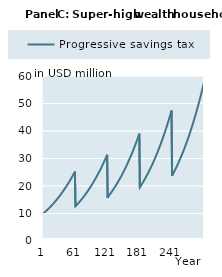
| Category | Progressive savings tax |
|---|---|
| 1 | 10000000 |
| 2 | 10167750 |
| 3 | 10337932.375 |
| 4 | 10510582.394 |
| 5 | 10685735.839 |
| 6 | 10863429.009 |
| 7 | 11043698.729 |
| 8 | 11226582.361 |
| 9 | 11412117.805 |
| 10 | 11600343.513 |
| 11 | 11791298.494 |
| 12 | 11985022.323 |
| 13 | 12181555.146 |
| 14 | 12380937.696 |
| 15 | 12583211.292 |
| 16 | 12788417.856 |
| 17 | 12996599.915 |
| 18 | 13207800.614 |
| 19 | 13422063.723 |
| 20 | 13639433.647 |
| 21 | 13859955.435 |
| 22 | 14083674.788 |
| 23 | 14310638.073 |
| 24 | 14540892.325 |
| 25 | 14774485.264 |
| 26 | 15011465.3 |
| 27 | 15251881.547 |
| 28 | 15495783.829 |
| 29 | 15743222.695 |
| 30 | 15994249.424 |
| 31 | 16248916.04 |
| 32 | 16507275.323 |
| 33 | 16769380.815 |
| 34 | 17035286.837 |
| 35 | 17305048.496 |
| 36 | 17578721.699 |
| 37 | 17856363.164 |
| 38 | 18138030.43 |
| 39 | 18423781.871 |
| 40 | 18713676.708 |
| 41 | 19007775.021 |
| 42 | 19294587.758 |
| 43 | 19585559.281 |
| 44 | 19880749.89 |
| 45 | 20180220.764 |
| 46 | 20484033.965 |
| 47 | 20792252.457 |
| 48 | 21104940.118 |
| 49 | 21422161.75 |
| 50 | 21743983.095 |
| 51 | 22070470.85 |
| 52 | 22401692.677 |
| 53 | 22737717.221 |
| 54 | 23078614.121 |
| 55 | 23424454.026 |
| 56 | 23775308.609 |
| 57 | 24131250.584 |
| 58 | 24492353.717 |
| 59 | 24858692.846 |
| 60 | 25230343.892 |
| 61 | 12615171.946 |
| 62 | 12820841.939 |
| 63 | 13029494.148 |
| 64 | 13241171.813 |
| 65 | 13455918.804 |
| 66 | 13673779.627 |
| 67 | 13894799.431 |
| 68 | 14119024.023 |
| 69 | 14346499.871 |
| 70 | 14577274.119 |
| 71 | 14811394.594 |
| 72 | 15048909.816 |
| 73 | 15289869.008 |
| 74 | 15534322.109 |
| 75 | 15782319.779 |
| 76 | 16033913.416 |
| 77 | 16289155.161 |
| 78 | 16548097.91 |
| 79 | 16810795.33 |
| 80 | 17077301.862 |
| 81 | 17347672.739 |
| 82 | 17621963.994 |
| 83 | 17900232.472 |
| 84 | 18182535.843 |
| 85 | 18468932.613 |
| 86 | 18759482.136 |
| 87 | 19054244.627 |
| 88 | 19353281.174 |
| 89 | 19656653.751 |
| 90 | 19964425.23 |
| 91 | 20276659.396 |
| 92 | 20593420.957 |
| 93 | 20914775.561 |
| 94 | 21240789.807 |
| 95 | 21571531.259 |
| 96 | 21907068.462 |
| 97 | 22247470.955 |
| 98 | 22592809.284 |
| 99 | 22943155.018 |
| 100 | 23298580.766 |
| 101 | 23659160.187 |
| 102 | 24013418.01 |
| 103 | 24372812.571 |
| 104 | 24737418.353 |
| 105 | 25107310.919 |
| 106 | 25482566.928 |
| 107 | 25863264.148 |
| 108 | 26249481.478 |
| 109 | 26641298.96 |
| 110 | 27038797.795 |
| 111 | 27442060.363 |
| 112 | 27851170.238 |
| 113 | 28266212.206 |
| 114 | 28687272.283 |
| 115 | 29114437.731 |
| 116 | 29547797.079 |
| 117 | 29987440.136 |
| 118 | 30433458.018 |
| 119 | 30885943.159 |
| 120 | 31344989.335 |
| 121 | 15672494.668 |
| 122 | 16152881.512 |
| 123 | 16409848.294 |
| 124 | 16670541.094 |
| 125 | 16935013.94 |
| 126 | 17203321.642 |
| 127 | 17475519.806 |
| 128 | 17751664.843 |
| 129 | 18031813.983 |
| 130 | 18316025.286 |
| 131 | 18604357.653 |
| 132 | 18896870.839 |
| 133 | 19193625.466 |
| 134 | 19494683.035 |
| 135 | 19800105.939 |
| 136 | 20109957.475 |
| 137 | 20424301.859 |
| 138 | 20743204.236 |
| 139 | 21066730.697 |
| 140 | 21394948.292 |
| 141 | 21727925.042 |
| 142 | 22065729.955 |
| 143 | 22408433.04 |
| 144 | 22756105.319 |
| 145 | 23108818.846 |
| 146 | 23466646.719 |
| 147 | 23829663.097 |
| 148 | 24197943.212 |
| 149 | 24571563.388 |
| 150 | 24950601.057 |
| 151 | 25335134.773 |
| 152 | 25725244.227 |
| 153 | 26121010.268 |
| 154 | 26522514.917 |
| 155 | 26929841.383 |
| 156 | 27343074.083 |
| 157 | 27762298.658 |
| 158 | 28187601.988 |
| 159 | 28619072.217 |
| 160 | 29056798.764 |
| 161 | 29500872.346 |
| 162 | 29939834.995 |
| 163 | 30385162.603 |
| 164 | 30836947.46 |
| 165 | 31295283.198 |
| 166 | 31760264.805 |
| 167 | 32231988.645 |
| 168 | 32710552.48 |
| 169 | 33196055.491 |
| 170 | 33688598.295 |
| 171 | 34188282.971 |
| 172 | 34695213.074 |
| 173 | 35209493.663 |
| 174 | 35731231.322 |
| 175 | 36260534.176 |
| 176 | 36797511.921 |
| 177 | 37342275.844 |
| 178 | 37894938.844 |
| 179 | 38455615.457 |
| 180 | 39024421.881 |
| 181 | 19512210.941 |
| 182 | 19817887.999 |
| 183 | 20127997.375 |
| 184 | 20442603.337 |
| 185 | 20761771.086 |
| 186 | 21085566.766 |
| 187 | 21414057.484 |
| 188 | 21747311.318 |
| 189 | 22085397.332 |
| 190 | 22428385.593 |
| 191 | 22776347.184 |
| 192 | 23129354.219 |
| 193 | 23487479.855 |
| 194 | 23850798.313 |
| 195 | 24219384.888 |
| 196 | 24593315.969 |
| 197 | 24972669.051 |
| 198 | 25357522.752 |
| 199 | 25747956.832 |
| 200 | 26144052.206 |
| 201 | 26545890.963 |
| 202 | 26953556.382 |
| 203 | 27367132.949 |
| 204 | 27786706.377 |
| 205 | 28212363.62 |
| 206 | 28644192.892 |
| 207 | 29082283.689 |
| 208 | 29526726.802 |
| 209 | 29977614.341 |
| 210 | 30435039.749 |
| 211 | 30899097.825 |
| 212 | 31369884.744 |
| 213 | 31847498.073 |
| 214 | 32332036.795 |
| 215 | 32823601.328 |
| 216 | 33322293.548 |
| 217 | 33828216.804 |
| 218 | 34341475.948 |
| 219 | 34862177.349 |
| 220 | 35390428.92 |
| 221 | 35926340.14 |
| 222 | 36458472.072 |
| 223 | 36998319.917 |
| 224 | 37545995.556 |
| 225 | 38101612.491 |
| 226 | 38665285.872 |
| 227 | 39237132.517 |
| 228 | 39817270.939 |
| 229 | 40405821.368 |
| 230 | 41002905.777 |
| 231 | 41608647.911 |
| 232 | 42223173.306 |
| 233 | 42846609.319 |
| 234 | 43479085.154 |
| 235 | 44120731.889 |
| 236 | 44771682.501 |
| 237 | 45432071.897 |
| 238 | 46102036.94 |
| 239 | 46781716.475 |
| 240 | 47471251.364 |
| 241 | 23735625.682 |
| 242 | 24102542.255 |
| 243 | 24474779.117 |
| 244 | 24852413.414 |
| 245 | 25235523.409 |
| 246 | 25624188.498 |
| 247 | 26018489.232 |
| 248 | 26418507.325 |
| 249 | 26824325.682 |
| 250 | 27236028.404 |
| 251 | 27653700.816 |
| 252 | 28077429.478 |
| 253 | 28507302.205 |
| 254 | 28943408.087 |
| 255 | 29385837.504 |
| 256 | 29834682.148 |
| 257 | 30290035.039 |
| 258 | 30751990.547 |
| 259 | 31220644.41 |
| 260 | 31696093.754 |
| 261 | 32178437.114 |
| 262 | 32667774.452 |
| 263 | 33164207.182 |
| 264 | 33667838.186 |
| 265 | 34178771.839 |
| 266 | 34697114.031 |
| 267 | 35222972.184 |
| 268 | 35756455.281 |
| 269 | 36297673.883 |
| 270 | 36846740.154 |
| 271 | 37403767.886 |
| 272 | 37968872.521 |
| 273 | 38542171.172 |
| 274 | 39123782.654 |
| 275 | 39713827.503 |
| 276 | 40312428.001 |
| 277 | 40919708.207 |
| 278 | 41535793.976 |
| 279 | 42160812.989 |
| 280 | 42794894.777 |
| 281 | 43438170.752 |
| 282 | 44079224.228 |
| 283 | 44729572.979 |
| 284 | 45389351.787 |
| 285 | 46058697.388 |
| 286 | 46737748.5 |
| 287 | 47426645.853 |
| 288 | 48125532.218 |
| 289 | 48834552.435 |
| 290 | 49553853.446 |
| 291 | 50283584.321 |
| 292 | 51023896.293 |
| 293 | 51774942.79 |
| 294 | 52536879.46 |
| 295 | 53309864.212 |
| 296 | 54094057.243 |
| 297 | 54889621.073 |
| 298 | 55696720.579 |
| 299 | 56515523.027 |
| 300 | 57346198.111 |